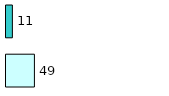
| Category | Series 0 | Series 1 |
|---|---|---|
| 0 | 49 | 11 |